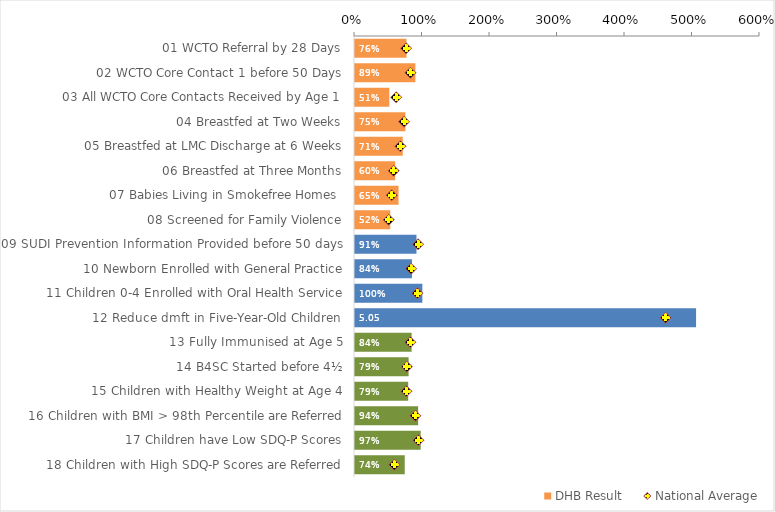
| Category | DHB Result |
|---|---|
| 01 WCTO Referral by 28 Days | 0.763 |
| 02 WCTO Core Contact 1 before 50 Days | 0.894 |
| 03 All WCTO Core Contacts Received by Age 1 | 0.508 |
| 04 Breastfed at Two Weeks | 0.746 |
| 05 Breastfed at LMC Discharge at 6 Weeks | 0.707 |
| 06 Breastfed at Three Months | 0.595 |
| 07 Babies Living in Smokefree Homes  | 0.645 |
| 08 Screened for Family Violence | 0.523 |
| 09 SUDI Prevention Information Provided before 50 days | 0.911 |
| 10 Newborn Enrolled with General Practice | 0.844 |
| 11 Children 0-4 Enrolled with Oral Health Service | 0.998 |
| 12 Reduce dmft in Five-Year-Old Children | 5.053 |
| 13 Fully Immunised at Age 5 | 0.839 |
| 14 B4SC Started before 4½ | 0.794 |
| 15 Children with Healthy Weight at Age 4 | 0.788 |
| 16 Children with BMI > 98th Percentile are Referred | 0.935 |
| 17 Children have Low SDQ-P Scores | 0.973 |
| 18 Children with High SDQ-P Scores are Referred | 0.737 |